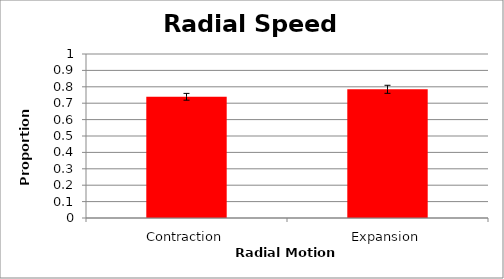
| Category | prop corr |
|---|---|
| Contraction | 0.739 |
| Expansion | 0.785 |